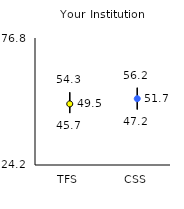
| Category | 25th | 75th | Mean |
|---|---|---|---|
| TFS | 45.7 | 54.3 | 49.5 |
| CSS | 47.2 | 56.2 | 51.67 |